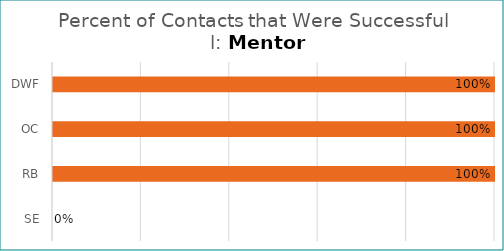
| Category | Percent Successful |
|---|---|
| DWF | 1 |
| OC | 1 |
| RB | 1 |
| SE | 0 |